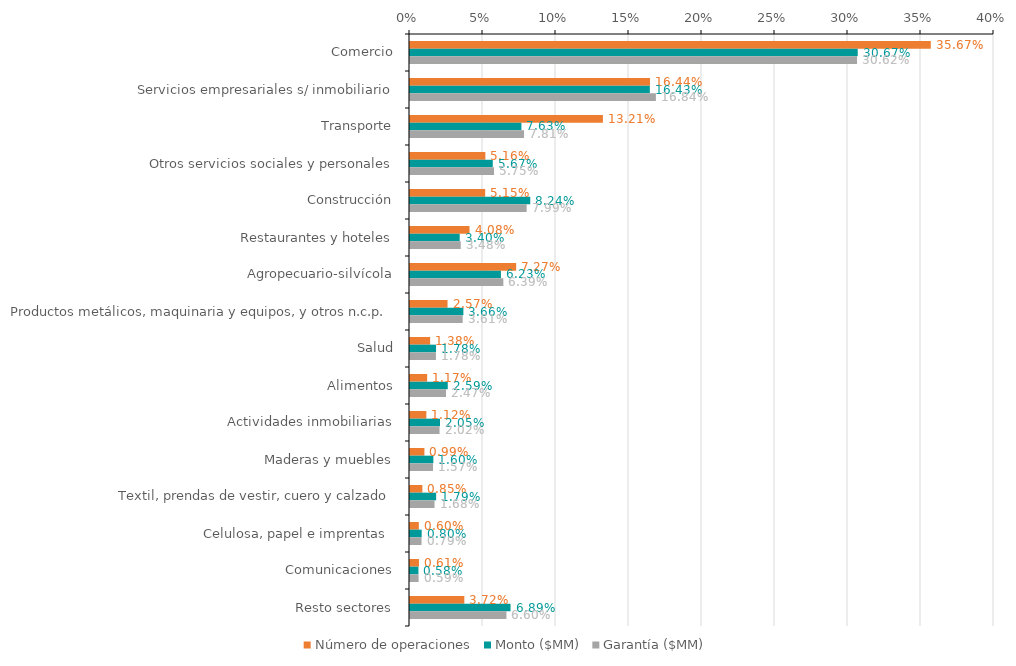
| Category | Número de operaciones | Monto ($MM) | Garantía ($MM) |
|---|---|---|---|
| Comercio | 0.357 | 0.307 | 0.306 |
| Servicios empresariales s/ inmobiliario | 0.164 | 0.164 | 0.168 |
| Transporte | 0.132 | 0.076 | 0.078 |
| Otros servicios sociales y personales | 0.052 | 0.057 | 0.058 |
| Construcción | 0.051 | 0.082 | 0.08 |
| Restaurantes y hoteles | 0.041 | 0.034 | 0.035 |
| Agropecuario-silvícola | 0.073 | 0.062 | 0.064 |
| Productos metálicos, maquinaria y equipos, y otros n.c.p. | 0.026 | 0.037 | 0.036 |
| Salud | 0.014 | 0.018 | 0.018 |
| Alimentos | 0.012 | 0.026 | 0.025 |
| Actividades inmobiliarias | 0.011 | 0.021 | 0.02 |
| Maderas y muebles | 0.01 | 0.016 | 0.016 |
| Textil, prendas de vestir, cuero y calzado | 0.008 | 0.018 | 0.017 |
| Celulosa, papel e imprentas  | 0.006 | 0.008 | 0.008 |
| Comunicaciones | 0.006 | 0.006 | 0.006 |
| Resto sectores | 0.037 | 0.069 | 0.066 |